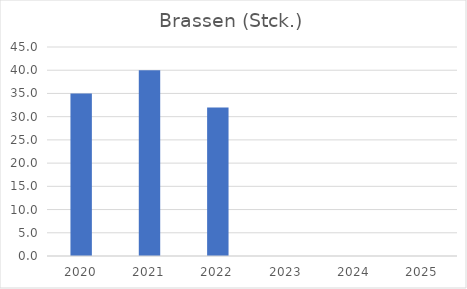
| Category | Brassen (Stck.) |
|---|---|
| 2020.0 | 35 |
| 2021.0 | 40 |
| 2022.0 | 32 |
| 2023.0 | 0 |
| 2024.0 | 0 |
| 2025.0 | 0 |